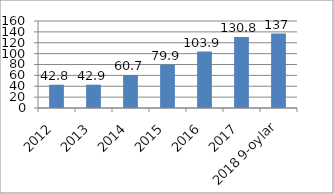
| Category | Series 0 |
|---|---|
| 2012 | 42.8 |
| 2013 | 42.9 |
| 2014 | 60.7 |
| 2015 | 79.9 |
| 2016 | 103.9 |
| 2017 | 130.8 |
| 2018 9-oylar | 137 |